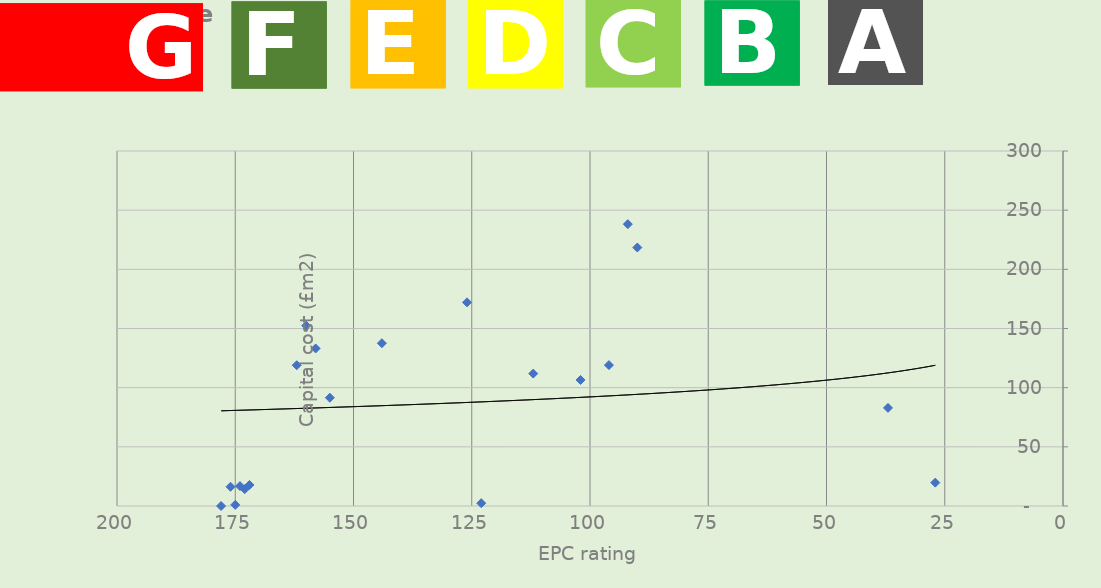
| Category | Series 0 |
|---|---|
| 126.0 | 0 |
| 90.0 | 91.481 |
| 92.0 | 119.074 |
| 112.0 | 118.936 |
| 102.0 | 133.158 |
| 112.0 | 14.223 |
| 105.0 | 17.778 |
| 125.0 | 0.948 |
| 96.0 | 16.265 |
| 94.0 | 16.83 |
| 76.0 | 82.899 |
| 124.0 | 2.37 |
| 121.0 | 19.753 |
| 78.0 | 137.571 |
| 63.0 | 152.359 |
| 59.0 | 172.112 |
| 40.0 | 218.428 |
| 35.0 | 238.181 |
| 69.0 | 111.901 |
| 106.0 | 106.527 |